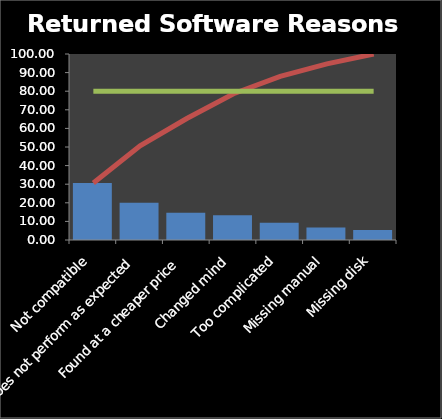
| Category | Percent of Total |
|---|---|
| Not compatible | 30.67 |
| Does not perform as expected | 20 |
| Found at a cheaper price | 14.67 |
| Changed mind | 13.33 |
| Too complicated | 9.33 |
| Missing manual | 6.67 |
| Missing disk | 5.33 |